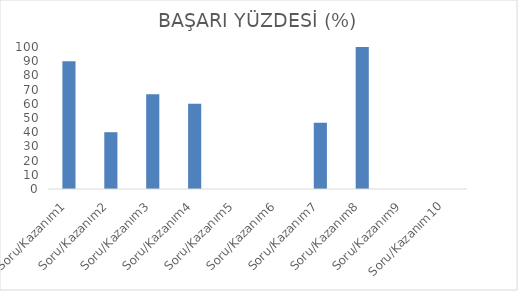
| Category | BAŞARI YÜZDESİ (%) |
|---|---|
| Soru/Kazanım1 | 90 |
| Soru/Kazanım2 | 40 |
| Soru/Kazanım3 | 66.667 |
| Soru/Kazanım4 | 60 |
| Soru/Kazanım5 | 0 |
| Soru/Kazanım6 | 0 |
| Soru/Kazanım7 | 46.667 |
| Soru/Kazanım8 | 100 |
| Soru/Kazanım9 | 0 |
| Soru/Kazanım10 | 0 |